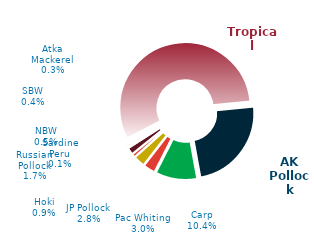
| Category | 2023 |
|---|---|
| Tropical | 227322.804 |
| AK Pollock | 95752 |
| Carp | 41896.905 |
| Pac Whiting | 12233.329 |
| JP Pollock | 11435.661 |
| Hoki | 3555.6 |
| Russian Pollock | 6971.978 |
| SBW | 1600.4 |
| NBW | 2110.841 |
| Atka Mackerel | 1172.378 |
| Sardine Peru | 264 |